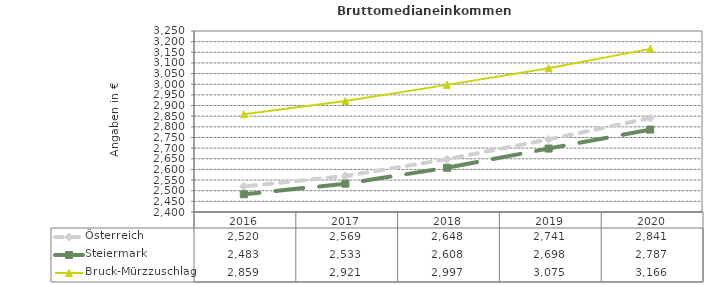
| Category | Österreich | Steiermark | Bruck-Mürzzuschlag |
|---|---|---|---|
| 2020.0 | 2841 | 2787 | 3166 |
| 2019.0 | 2741 | 2698 | 3075 |
| 2018.0 | 2648 | 2608 | 2997 |
| 2017.0 | 2569 | 2533 | 2921 |
| 2016.0 | 2520 | 2483 | 2859 |